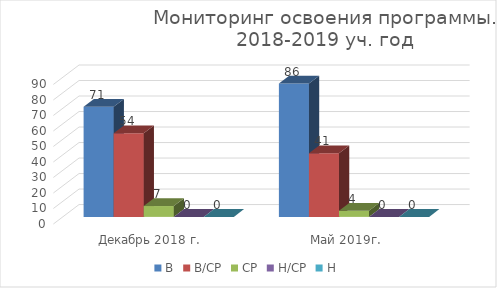
| Category | В | В/СР | СР | Н/СР | Н |
|---|---|---|---|---|---|
| Декабрь 2018 г. | 71 | 54 | 7 | 0 | 0 |
| Май 2019г. | 86 | 41 | 4 | 0 | 0 |